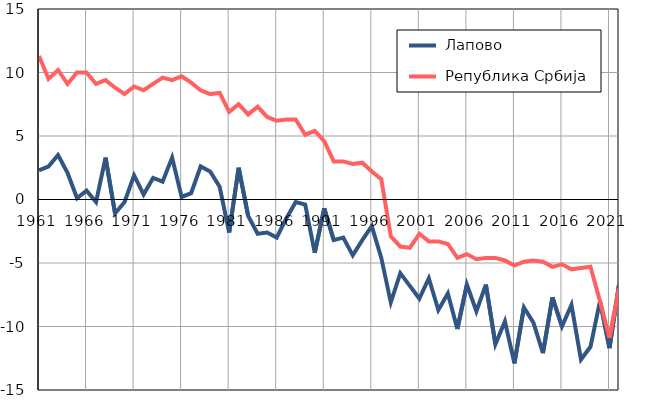
| Category |  Лапово |  Република Србија |
|---|---|---|
| 1961.0 | 2.3 | 11.3 |
| 1962.0 | 2.6 | 9.5 |
| 1963.0 | 3.5 | 10.2 |
| 1964.0 | 2.1 | 9.1 |
| 1965.0 | 0.1 | 10 |
| 1966.0 | 0.7 | 10 |
| 1967.0 | -0.2 | 9.1 |
| 1968.0 | 3.3 | 9.4 |
| 1969.0 | -1.1 | 8.8 |
| 1970.0 | -0.2 | 8.3 |
| 1971.0 | 1.9 | 8.9 |
| 1972.0 | 0.4 | 8.6 |
| 1973.0 | 1.7 | 9.1 |
| 1974.0 | 1.4 | 9.6 |
| 1975.0 | 3.3 | 9.4 |
| 1976.0 | 0.2 | 9.7 |
| 1977.0 | 0.5 | 9.2 |
| 1978.0 | 2.6 | 8.6 |
| 1979.0 | 2.2 | 8.3 |
| 1980.0 | 1 | 8.4 |
| 1981.0 | -2.6 | 6.9 |
| 1982.0 | 2.5 | 7.5 |
| 1983.0 | -1.3 | 6.7 |
| 1984.0 | -2.7 | 7.3 |
| 1985.0 | -2.6 | 6.5 |
| 1986.0 | -3 | 6.2 |
| 1987.0 | -1.5 | 6.3 |
| 1988.0 | -0.2 | 6.3 |
| 1989.0 | -0.4 | 5.1 |
| 1990.0 | -4.2 | 5.4 |
| 1991.0 | -0.7 | 4.6 |
| 1992.0 | -3.2 | 3 |
| 1993.0 | -3 | 3 |
| 1994.0 | -4.4 | 2.8 |
| 1995.0 | -3.2 | 2.9 |
| 1996.0 | -2.1 | 2.2 |
| 1997.0 | -4.6 | 1.6 |
| 1998.0 | -8.1 | -2.9 |
| 1999.0 | -5.8 | -3.7 |
| 2000.0 | -6.8 | -3.8 |
| 2001.0 | -7.8 | -2.7 |
| 2002.0 | -6.2 | -3.3 |
| 2003.0 | -8.7 | -3.3 |
| 2004.0 | -7.4 | -3.5 |
| 2005.0 | -10.2 | -4.6 |
| 2006.0 | -6.7 | -4.3 |
| 2007.0 | -8.8 | -4.7 |
| 2008.0 | -6.7 | -4.6 |
| 2009.0 | -11.4 | -4.6 |
| 2010.0 | -9.6 | -4.8 |
| 2011.0 | -12.9 | -5.2 |
| 2012.0 | -8.5 | -4.9 |
| 2013.0 | -9.7 | -4.8 |
| 2014.0 | -12.1 | -4.9 |
| 2015.0 | -7.7 | -5.3 |
| 2016.0 | -10 | -5.1 |
| 2017.0 | -8.3 | -5.5 |
| 2018.0 | -12.6 | -5.4 |
| 2019.0 | -11.6 | -5.3 |
| 2020.0 | -8 | -8 |
| 2021.0 | -11.7 | -10.9 |
| 2022.0 | -6.7 | -7 |